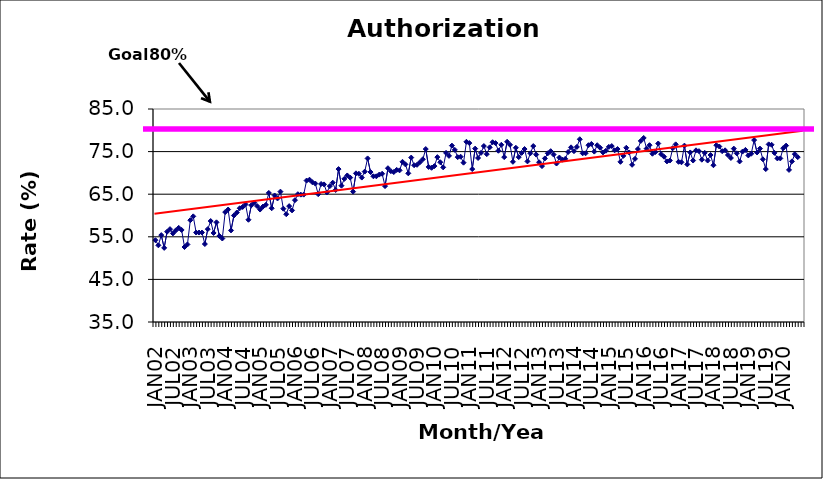
| Category | Series 0 |
|---|---|
| JAN02 | 54.2 |
| FEB02 | 53 |
| MAR02 | 55.4 |
| APR02 | 52.4 |
| MAY02 | 56.2 |
| JUN02 | 56.8 |
| JUL02 | 55.8 |
| AUG02 | 56.5 |
| SEP02 | 57.1 |
| OCT02 | 56.6 |
| NOV02 | 52.6 |
| DEC02 | 53.2 |
| JAN03 | 58.9 |
| FEB03 | 59.8 |
| MAR03 | 56 |
| APR03 | 56 |
| MAY03 | 56 |
| JUN03 | 53.3 |
| JUL03 | 56.8 |
| AUG03 | 58.7 |
| SEP03 | 55.9 |
| OCT03 | 58.4 |
| NOV03 | 55.2 |
| DEC03 | 54.6 |
| JAN04 | 60.8 |
| FEB04 | 61.4 |
| MAR04 | 56.5 |
| APR04 | 60 |
| MAY04 | 60.7 |
| JUN04 | 61.7 |
| JUL04 | 62 |
| AUG04 | 62.6 |
| SEP04 | 59 |
| OCT04 | 62.4 |
| NOV04 | 63 |
| DEC04 | 62.2 |
| JAN05 | 61.4 |
| FEB05 | 62.1 |
| MAR05 | 62.5 |
| APR05 | 65.3 |
| MAY05 | 61.7 |
| JUN05 | 64.7 |
| JUL05 | 64 |
| AUG05 | 65.6 |
| SEP05 | 61.6 |
| OCT05 | 60.3 |
| NOV05 | 62.2 |
| DEC05 | 61.2 |
| JAN06 | 63.6 |
| FEB06 | 65 |
| MAR06 | 64.9 |
| APR06 | 64.9 |
| MAY06 | 68.2 |
| JUN06 | 68.4 |
| JUL06 | 67.8 |
| AUG06 | 67.5 |
| SEP06 | 65 |
| OCT06 | 67.4 |
| NOV06 | 67.3 |
| DEC06 | 65.4 |
| JAN07 | 66.9 |
| FEB07 | 67.7 |
| MAR07 | 66 |
| APR07 | 70.9 |
| MAY07 | 67 |
| JUN07 | 68.6 |
| JUL07 | 69.4 |
| AUG07 | 68.9 |
| SEP07 | 65.6 |
| OCT07 | 69.9 |
| NOV07 | 69.8 |
| DEC07 | 68.9 |
| JAN08 | 70.3 |
| FEB08 | 73.4 |
| MAR08 | 70.2 |
| APR08 | 69.2 |
| MAY08 | 69.2 |
| JUN08 | 69.6 |
| JUL08 | 69.8 |
| AUG08 | 66.9 |
| SEP08 | 71.1 |
| OCT08 | 70.4 |
| NOV08 | 70.2 |
| DEC08 | 70.7 |
| JAN09 | 70.6 |
| FEB09 | 72.6 |
| MAR09 | 72 |
| APR09 | 69.9 |
| MAY09 | 73.6 |
| JUN09 | 71.8 |
| JUL09 | 71.9 |
| AUG09 | 72.5 |
| SEP09 | 73.2 |
| OCT09 | 75.6 |
| NOV09 | 71.4 |
| DEC09 | 71.2 |
| JAN10 | 71.6 |
| FEB10 | 73.7 |
| MAR10 | 72.5 |
| APR10 | 71.3 |
| MAY10 | 74.7 |
| JUN10 | 74 |
| JUL10 | 76.4 |
| AUG10 | 75.4 |
| SEP10 | 73.7 |
| OCT10 | 73.8 |
| NOV10 | 72.4 |
| DEC10 | 77.3 |
| JAN11 | 77 |
| FEB11 | 70.9 |
| MAR11 | 75.7 |
| APR11 | 73.5 |
| MAY11 | 74.7 |
| JUN11 | 76.3 |
| JUL11 | 74.4 |
| AUG11 | 76 |
| SEP11 | 77.2 |
| OCT11 | 77 |
| NOV11 | 75.2 |
| DEC11 | 76.6 |
| JAN12 | 73.7 |
| FEB12 | 77.3 |
| MAR12 | 76.6 |
| APR12 | 72.6 |
| MAY12 | 75.9 |
| JUN12 | 73.7 |
| JUL12 | 74.7 |
| AUG12 | 75.6 |
| SEP12 | 72.7 |
| OCT12 | 74.6 |
| NOV12 | 76.3 |
| DEC12 | 74.3 |
| JAN13 | 72.5 |
| FEB13 | 71.6 |
| MAR13 | 73.4 |
| APR13 | 74.6 |
| MAY13 | 75.1 |
| JUN13 | 74.3 |
| JUL13 | 72.2 |
| AUG13 | 73.6 |
| SEP13 | 73.1 |
| OCT13 | 73.3 |
| NOV13 | 74.9 |
| DEC13 | 76 |
| JAN14 | 75.1 |
| FEB14 | 76.1 |
| MAR14 | 77.9 |
| APR14 | 74.6 |
| MAY14 | 74.6 |
| JUN14 | 76.5 |
| JUL14 | 76.8 |
| AUG14 | 75 |
| SEP14 | 76.5 |
| OCT14 | 75.9 |
| NOV14 | 74.8 |
| DEC14 | 75.2 |
| JAN15 | 76.1 |
| FEB15 | 76.3 |
| MAR15 | 75.3 |
| APR15 | 75.6 |
| MAY15 | 72.6 |
| JUN15 | 74 |
| JUL15 | 75.9 |
| AUG15 | 74.8 |
| SEP15 | 71.9 |
| OCT15 | 73.3 |
| NOV15 | 75.6 |
| DEC15 | 77.5 |
| JAN16 | 78.2 |
| FEB16 | 75.7 |
| MAR16 | 76.5 |
| APR16 | 74.5 |
| MAY16 | 74.9 |
| JUN16 | 76.9 |
| JUL16 | 74.4 |
| AUG16 | 73.8 |
| SEP16 | 72.7 |
| OCT16 | 72.9 |
| NOV16 | 75.8 |
| DEC16 | 76.7 |
| JAN17 | 72.6 |
| FEB17 | 72.5 |
| MAR17 | 76.4 |
| APR17 | 72 |
| MAY17 | 74.8 |
| JUN17 | 72.9 |
| JUL17 | 75.3 |
| AUG17 | 75.1 |
| SEP17 | 73.1 |
| OCT17 | 74.7 |
| NOV17 | 72.9 |
| DEC17 | 74.2 |
| JAN18 | 71.8 |
| FEB18 | 76.5 |
| MAR18 | 76.2 |
| APR18 | 75.1 |
| MAY18 | 75.3 |
| JUN18 | 74.2 |
| JUL18 | 73.5 |
| AUG18 | 75.7 |
| SEP18 | 74.6 |
| OCT18 | 72.7 |
| NOV18 | 75 |
| DEC18 | 75.4 |
| JAN19 | 74.1 |
| FEB19 | 74.5 |
| MAR19 | 77.7 |
| APR19 | 74.8 |
| MAY19 | 75.7 |
| JUN19 | 73.2 |
| JUL19 | 70.9 |
| AUG19 | 76.7 |
| SEP19 | 76.6 |
| OCT19 | 74.7 |
| NOV19 | 73.4 |
| DEC19 | 73.4 |
| JAN20 | 75.8 |
| FEB20 | 76.4 |
| MAR20 | 70.7 |
| APR20 | 72.7 |
| MAY20 | 74.4 |
| JUN20 | 73.7 |